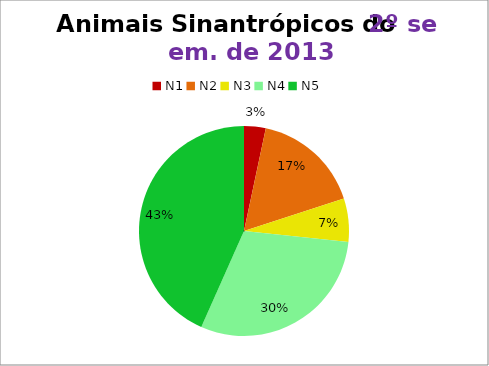
| Category | 2º/13 |
|---|---|
| N1 | 1 |
| N2 | 5 |
| N3 | 2 |
| N4 | 9 |
| N5 | 13 |